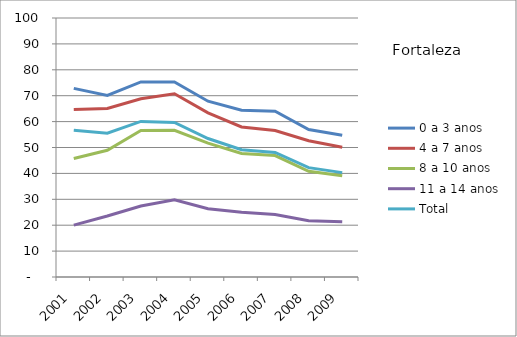
| Category | 0 a 3 anos | 4 a 7 anos | 8 a 10 anos | 11 a 14 anos | Total |
|---|---|---|---|---|---|
| 2001.0 | 72.84 | 64.71 | 45.74 | 20.04 | 56.69 |
| 2002.0 | 70.12 | 65.08 | 48.92 | 23.53 | 55.52 |
| 2003.0 | 75.3 | 68.83 | 56.57 | 27.43 | 60.06 |
| 2004.0 | 75.27 | 70.76 | 56.64 | 29.81 | 59.69 |
| 2005.0 | 67.88 | 63.4 | 51.69 | 26.35 | 53.48 |
| 2006.0 | 64.36 | 57.95 | 47.69 | 25.01 | 49.14 |
| 2007.0 | 64.02 | 56.58 | 46.88 | 24.15 | 48.08 |
| 2008.0 | 56.91 | 52.61 | 40.83 | 21.75 | 42.23 |
| 2009.0 | 54.76 | 50.1 | 39.13 | 21.29 | 40.3 |